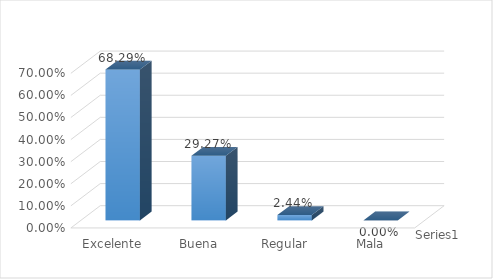
| Category | Series 0 |
|---|---|
| Excelente | 0.683 |
| Buena | 0.293 |
| Regular | 0.024 |
| Mala | 0 |